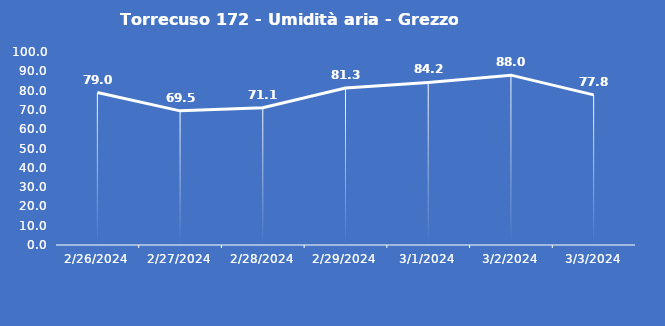
| Category | Torrecuso 172 - Umidità aria - Grezzo (%) |
|---|---|
| 2/26/24 | 79 |
| 2/27/24 | 69.5 |
| 2/28/24 | 71.1 |
| 2/29/24 | 81.3 |
| 3/1/24 | 84.2 |
| 3/2/24 | 88 |
| 3/3/24 | 77.8 |